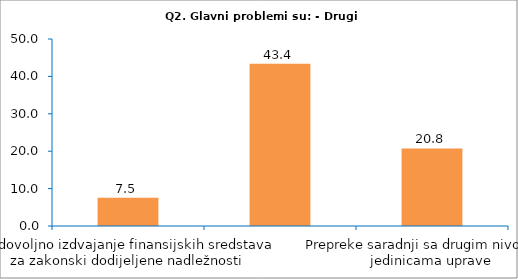
| Category | Series 0 |
|---|---|
| Nedovoljno izdvajanje finansijskih sredstava za zakonski dodijeljene nadležnosti | 7.547 |
| Zastarjeli sistem raspodjele javnih prihoda sa lokalnim vlastima | 43.396 |
| Prepreke saradnji sa drugim nivoima i jedinicama uprave | 20.755 |